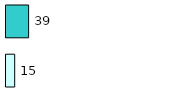
| Category | Series 0 | Series 1 |
|---|---|---|
| 0 | 15 | 39 |